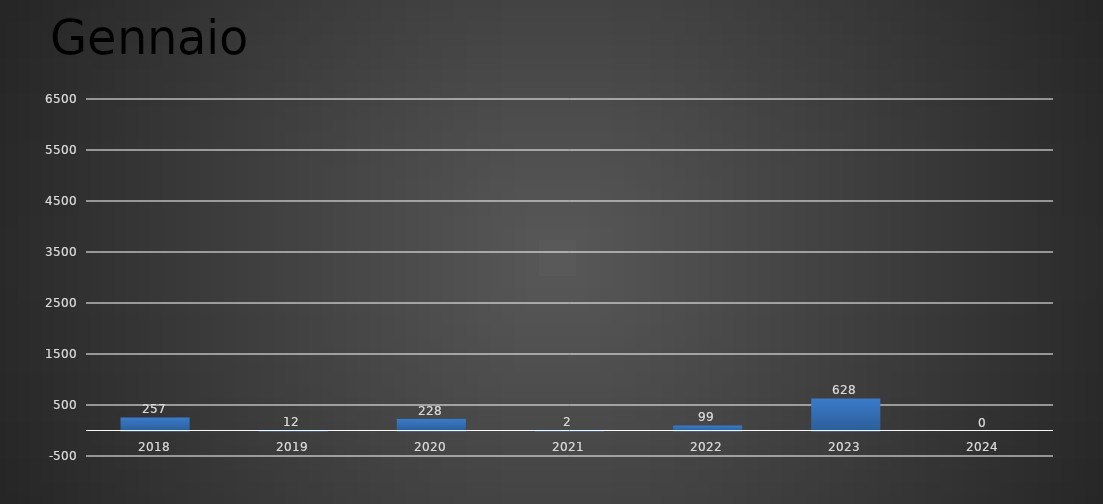
| Category | Gennaio |
|---|---|
| 2018.0 | 257 |
| 2019.0 | 12 |
| 2020.0 | 228 |
| 2021.0 | 2 |
| 2022.0 | 99 |
| 2023.0 | 628 |
| 2024.0 | 0 |